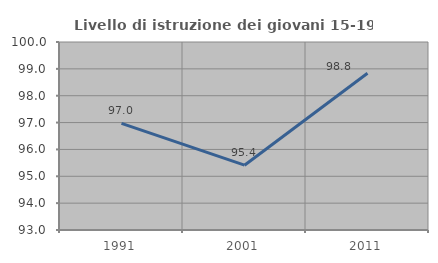
| Category | Livello di istruzione dei giovani 15-19 anni |
|---|---|
| 1991.0 | 96.97 |
| 2001.0 | 95.413 |
| 2011.0 | 98.837 |